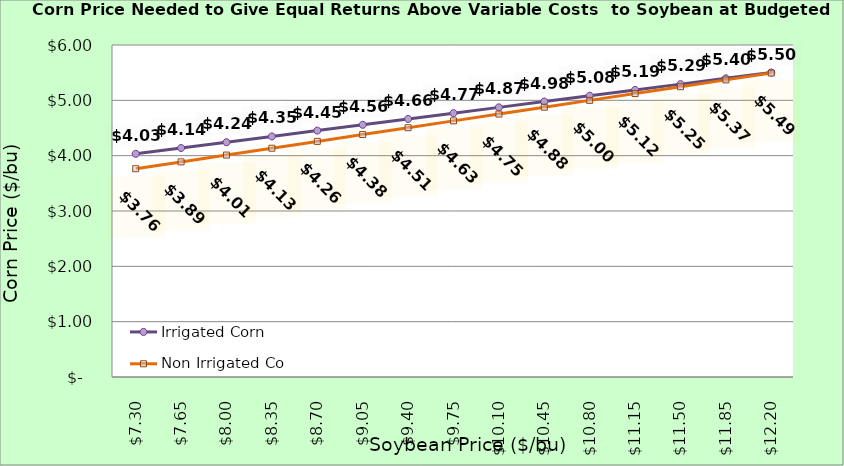
| Category | Irrigated Corn | Non Irrigated Corn |
|---|---|---|
| 7.3000000000000025 | 4.033 | 3.764 |
| 7.650000000000002 | 4.138 | 3.887 |
| 8.000000000000002 | 4.243 | 4.011 |
| 8.350000000000001 | 4.348 | 4.134 |
| 8.700000000000001 | 4.453 | 4.258 |
| 9.05 | 4.558 | 4.381 |
| 9.4 | 4.663 | 4.505 |
| 9.75 | 4.768 | 4.629 |
| 10.1 | 4.873 | 4.752 |
| 10.45 | 4.978 | 4.876 |
| 10.799999999999999 | 5.083 | 4.999 |
| 11.149999999999999 | 5.188 | 5.123 |
| 11.499999999999998 | 5.293 | 5.246 |
| 11.849999999999998 | 5.398 | 5.37 |
| 12.199999999999998 | 5.503 | 5.493 |